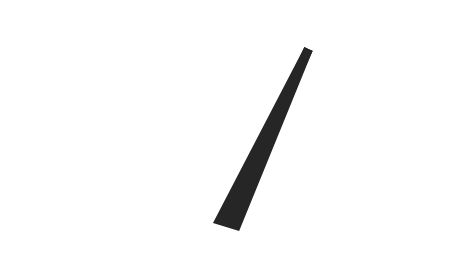
| Category | y |
|---|---|
| 67.64646039670293 | 46.783 |
| 51.87130005524185 | -0.706 |
| 48.128699944758154 | 0.706 |
| 67.64646039670293 | 46.783 |
| 50.0 | 0 |